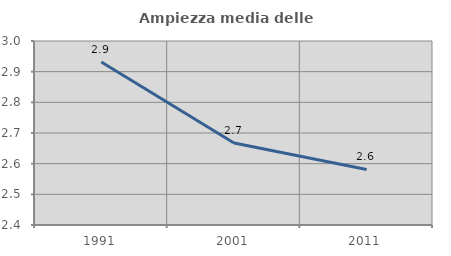
| Category | Ampiezza media delle famiglie |
|---|---|
| 1991.0 | 2.932 |
| 2001.0 | 2.667 |
| 2011.0 | 2.581 |